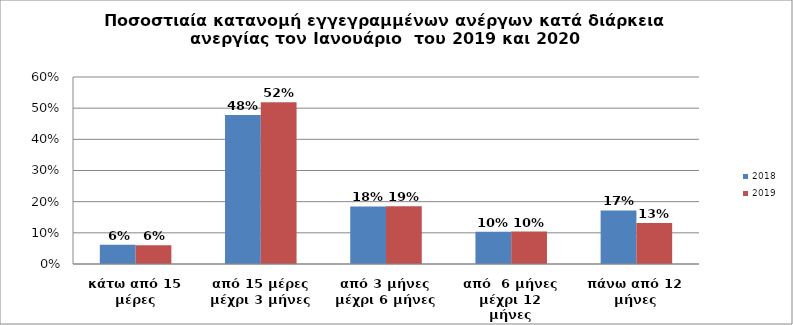
| Category | 2018 | 2019 |
|---|---|---|
| κάτω από 15 μέρες | 0.062 | 0.06 |
| από 15 μέρες μέχρι 3 μήνες | 0.478 | 0.519 |
| από 3 μήνες μέχρι 6 μήνες | 0.185 | 0.185 |
| από  6 μήνες μέχρι 12 μήνες | 0.103 | 0.104 |
| πάνω από 12 μήνες | 0.172 | 0.132 |